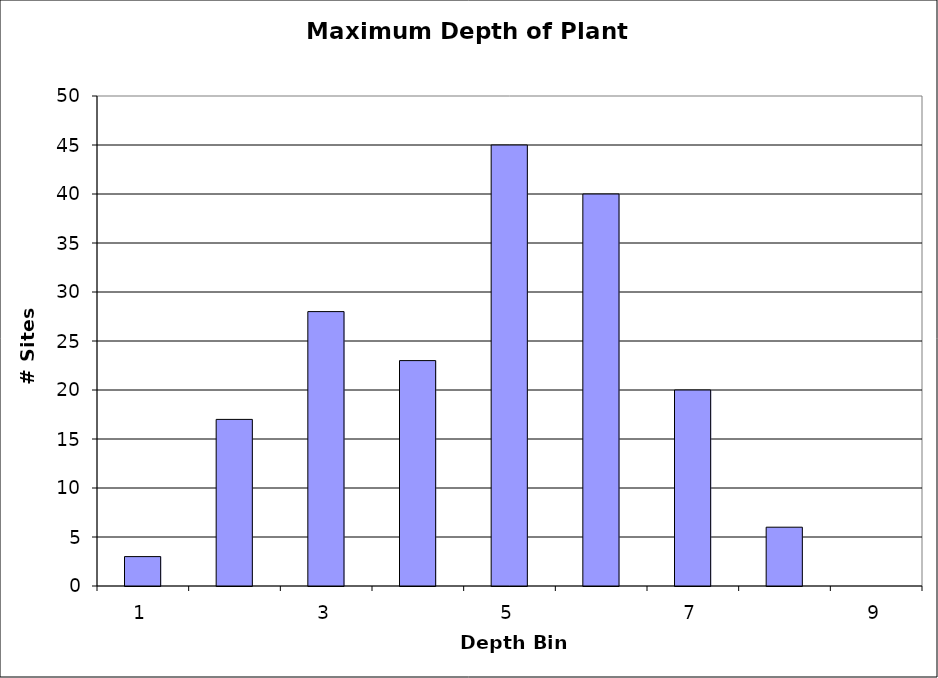
| Category | Series 0 |
|---|---|
| 1.0 | 3 |
| 2.0 | 17 |
| 3.0 | 28 |
| 4.0 | 23 |
| 5.0 | 45 |
| 6.0 | 40 |
| 7.0 | 20 |
| 8.0 | 6 |
| 9.0 | 0 |